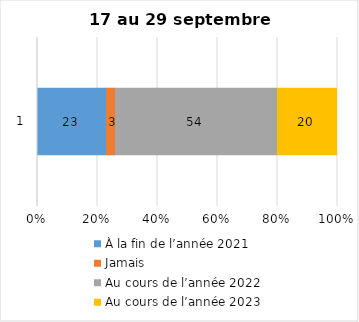
| Category | À la fin de l’année 2021 | Jamais | Au cours de l’année 2022 | Au cours de l’année 2023 |
|---|---|---|---|---|
| 0 | 23 | 3 | 54 | 20 |